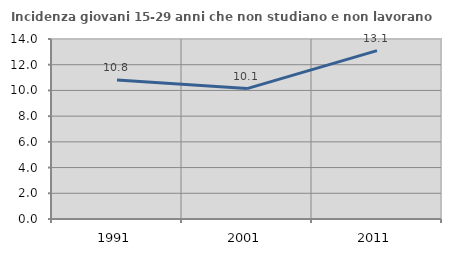
| Category | Incidenza giovani 15-29 anni che non studiano e non lavorano  |
|---|---|
| 1991.0 | 10.811 |
| 2001.0 | 10.145 |
| 2011.0 | 13.095 |